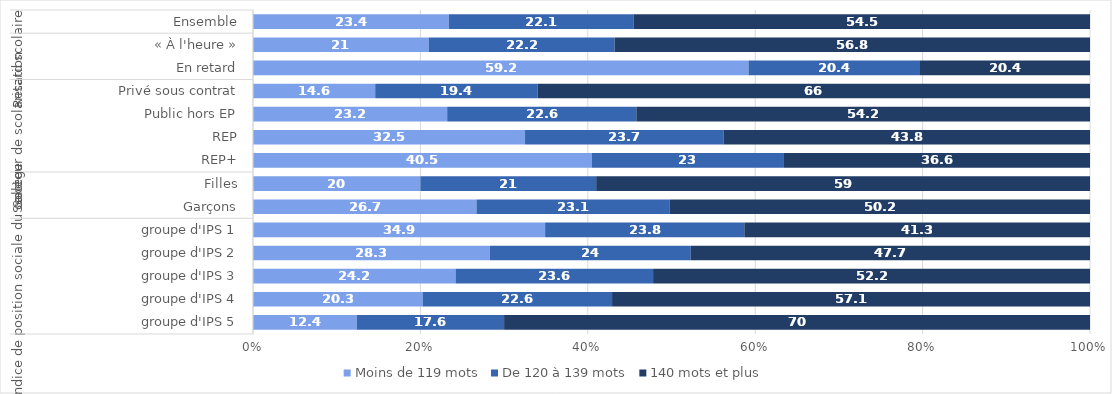
| Category | Moins de 119 mots | De 120 à 139 mots | 140 mots et plus |
|---|---|---|---|
| 0 | 23.4 | 22.1 | 54.5 |
| 1 | 21 | 22.2 | 56.8 |
| 2 | 59.2 | 20.4 | 20.4 |
| 3 | 14.6 | 19.4 | 66 |
| 4 | 23.2 | 22.6 | 54.2 |
| 5 | 32.5 | 23.7 | 43.8 |
| 6 | 40.5 | 23 | 36.6 |
| 7 | 20 | 21 | 59 |
| 8 | 26.7 | 23.1 | 50.2 |
| 9 | 34.9 | 23.8 | 41.3 |
| 10 | 28.3 | 24 | 47.7 |
| 11 | 24.2 | 23.6 | 52.2 |
| 12 | 20.3 | 22.6 | 57.1 |
| 13 | 12.4 | 17.6 | 70 |